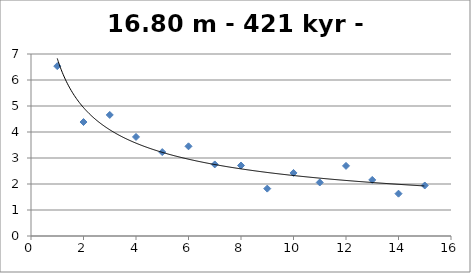
| Category | Series 1 |
|---|---|
| 1.0 | 6.534 |
| 2.0 | 4.383 |
| 3.0 | 4.656 |
| 4.0 | 3.81 |
| 5.0 | 3.227 |
| 6.0 | 3.45 |
| 7.0 | 2.753 |
| 8.0 | 2.712 |
| 9.0 | 1.823 |
| 10.0 | 2.425 |
| 11.0 | 2.058 |
| 12.0 | 2.697 |
| 13.0 | 2.157 |
| 14.0 | 1.628 |
| 15.0 | 1.943 |